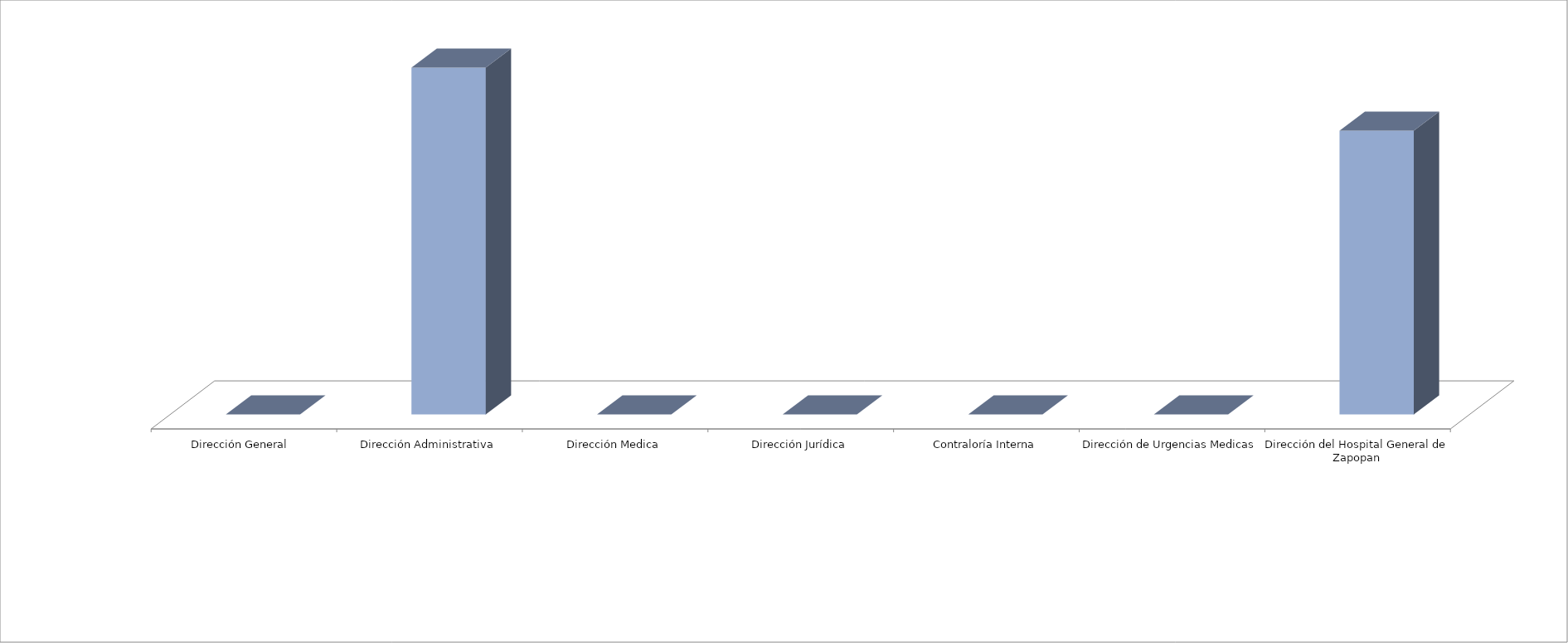
| Category | Series 0 | Series 1 |
|---|---|---|
| Dirección General  |  | 0 |
| Dirección Administrativa |  | 11 |
| Dirección Medica |  | 0 |
| Dirección Jurídica |  | 0 |
| Contraloría Interna |  | 0 |
| Dirección de Urgencias Medicas |  | 0 |
| Dirección del Hospital General de Zapopan |  | 9 |